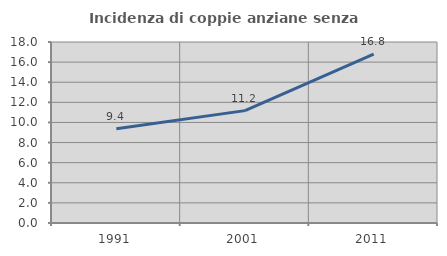
| Category | Incidenza di coppie anziane senza figli  |
|---|---|
| 1991.0 | 9.368 |
| 2001.0 | 11.174 |
| 2011.0 | 16.784 |